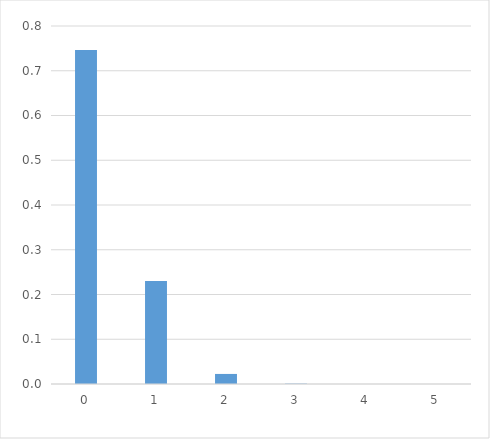
| Category | Series 0 |
|---|---|
| 0.0 | 0.746 |
| 1.0 | 0.23 |
| 2.0 | 0.022 |
| 3.0 | 0.001 |
| 4.0 | 0 |
| 5.0 | 0 |